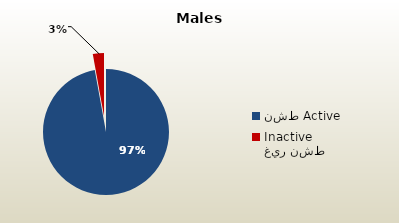
| Category | الذكور غير القطريين  Non-Qatari Males |
|---|---|
| نشط Active | 1687939 |
| غير نشط Inactive | 49613 |